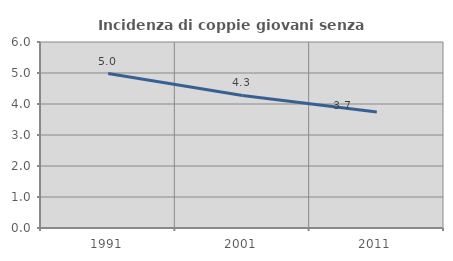
| Category | Incidenza di coppie giovani senza figli |
|---|---|
| 1991.0 | 4.983 |
| 2001.0 | 4.275 |
| 2011.0 | 3.74 |